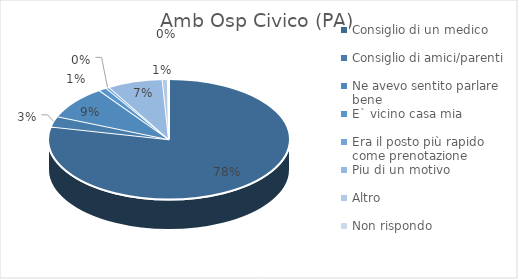
| Category | Amb Osp Civico (PA) | Amb Osp Dei Bambini G. Di Cristina (PA) |
|---|---|---|
| Consiglio di un medico | 0.784 | 0.765 |
| Consiglio di amici/parenti | 0.029 | 0.025 |
| Ne avevo sentito parlare bene | 0.09 | 0.074 |
| E` vicino casa mia | 0.011 | 0.037 |
| Era il posto più rapido come prenotazione | 0.005 | 0.012 |
| Piu di un motivo | 0.074 | 0.086 |
| Altro | 0.007 | 0 |
| Non rispondo | 0.002 | 0 |